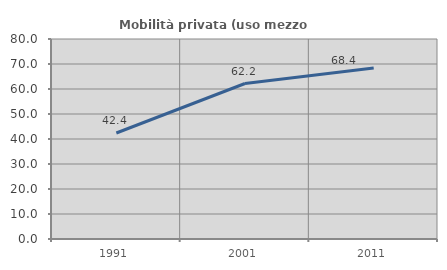
| Category | Mobilità privata (uso mezzo privato) |
|---|---|
| 1991.0 | 42.393 |
| 2001.0 | 62.198 |
| 2011.0 | 68.418 |